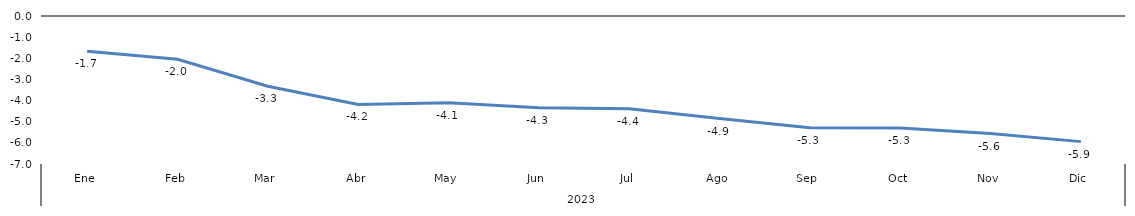
| Category | Bogotá |
|---|---|
| 0 | -1.667 |
| 1 | -2.043 |
| 2 | -3.32 |
| 3 | -4.182 |
| 4 | -4.103 |
| 5 | -4.343 |
| 6 | -4.385 |
| 7 | -4.853 |
| 8 | -5.29 |
| 9 | -5.292 |
| 10 | -5.562 |
| 11 | -5.941 |